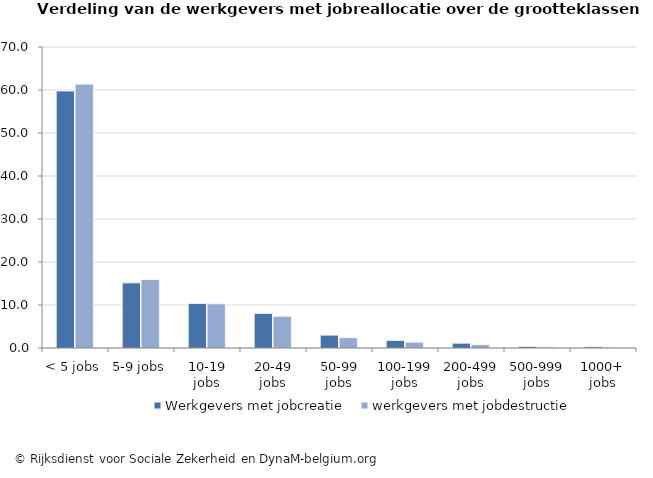
| Category | Werkgevers met jobcreatie | werkgevers met jobdestructie |
|---|---|---|
| < 5 jobs | 59.786 | 61.378 |
| 5-9 jobs | 15.148 | 15.92 |
| 10-19 jobs | 10.378 | 10.284 |
| 20-49 jobs | 8.068 | 7.398 |
| 50-99 jobs | 3.008 | 2.411 |
| 100-199 jobs | 1.787 | 1.369 |
| 200-499 jobs | 1.138 | 0.791 |
| 500-999 jobs | 0.386 | 0.244 |
| 1000+ jobs | 0.3 | 0.203 |